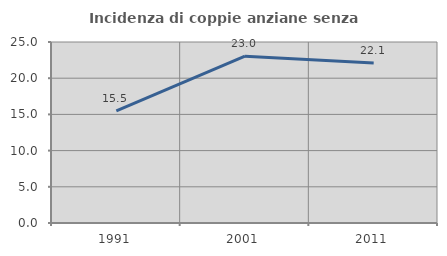
| Category | Incidenza di coppie anziane senza figli  |
|---|---|
| 1991.0 | 15.496 |
| 2001.0 | 23.044 |
| 2011.0 | 22.107 |